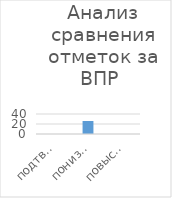
| Category | Series 0 |
|---|---|
| подтвердил | 0 |
| понизил | 26 |
| повысил | 0 |